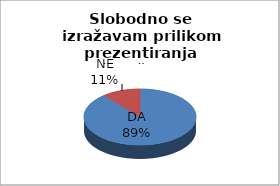
| Category | Series 0 |
|---|---|
| DA | 16 |
| NE | 2 |